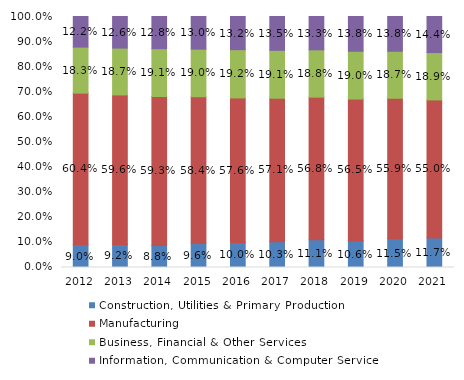
| Category | Construction, Utilities & Primary Production  | Manufacturing  | Business, Financial & Other Services | Information, Communication & Computer Services |
|---|---|---|---|---|
| 2012.0 | 0.09 | 0.604 | 0.183 | 0.122 |
| 2013.0 | 0.092 | 0.596 | 0.187 | 0.126 |
| 2014.0 | 0.088 | 0.593 | 0.191 | 0.128 |
| 2015.0 | 0.096 | 0.584 | 0.19 | 0.13 |
| 2016.0 | 0.1 | 0.576 | 0.192 | 0.132 |
| 2017.0 | 0.103 | 0.571 | 0.191 | 0.135 |
| 2018.0 | 0.111 | 0.568 | 0.188 | 0.133 |
| 2019.0 | 0.106 | 0.565 | 0.19 | 0.138 |
| 2020.0 | 0.115 | 0.559 | 0.187 | 0.138 |
| 2021.0 | 0.117 | 0.55 | 0.189 | 0.144 |